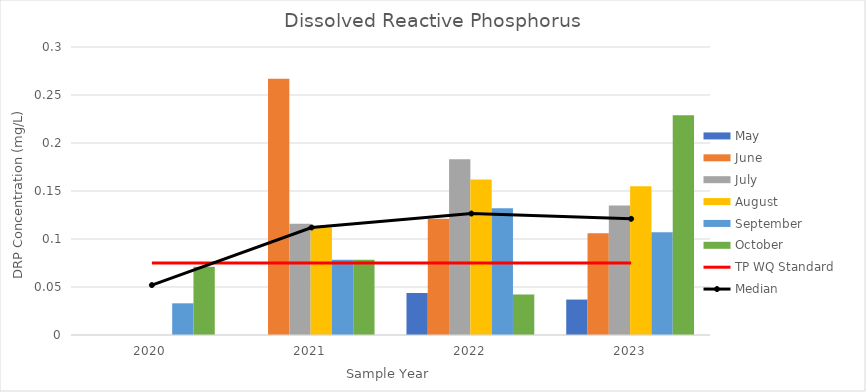
| Category | May | June | July | August | September | October |
|---|---|---|---|---|---|---|
| 2020.0 | 0 | 0 | 0 | 0 | 0.033 | 0.071 |
| 2021.0 | 0 | 0.267 | 0.116 | 0.112 | 0.078 | 0.078 |
| 2022.0 | 0.044 | 0.121 | 0.183 | 0.162 | 0.132 | 0.042 |
| 2023.0 | 0.037 | 0.106 | 0.135 | 0.155 | 0.107 | 0.229 |